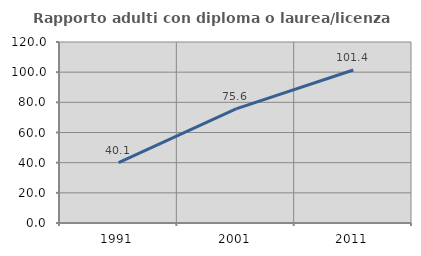
| Category | Rapporto adulti con diploma o laurea/licenza media  |
|---|---|
| 1991.0 | 40.056 |
| 2001.0 | 75.644 |
| 2011.0 | 101.411 |